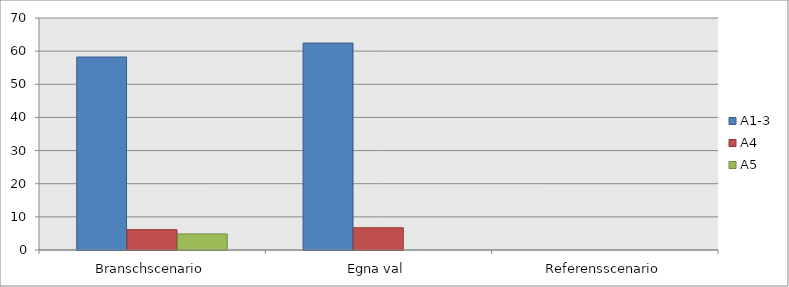
| Category | A1-3 | A4 | A5 |
|---|---|---|---|
| Branschscenario | 58.23 | 6.13 | 4.85 |
| Egna val | 62.43 | 6.71 | 0 |
| Referensscenario | 0 | 0 | 0 |